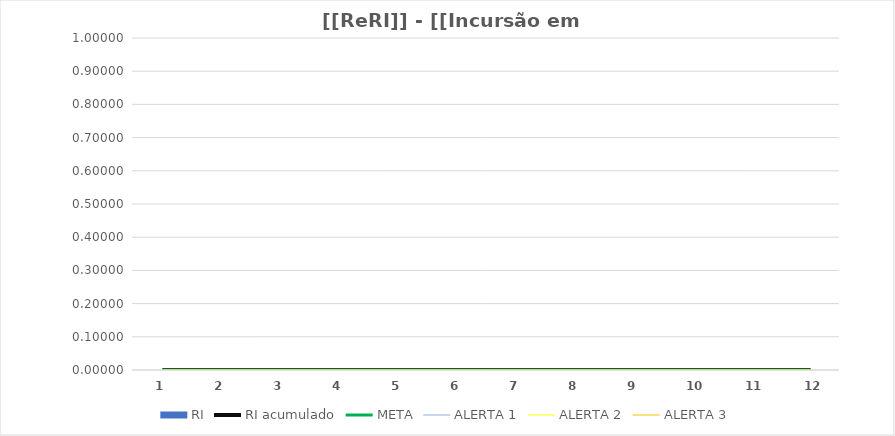
| Category | RI |
|---|---|
| 0 | 0 |
| 1 | 0 |
| 2 | 0 |
| 3 | 0 |
| 4 | 0 |
| 5 | 0 |
| 6 | 0 |
| 7 | 0 |
| 8 | 0 |
| 9 | 0 |
| 10 | 0 |
| 11 | 0 |